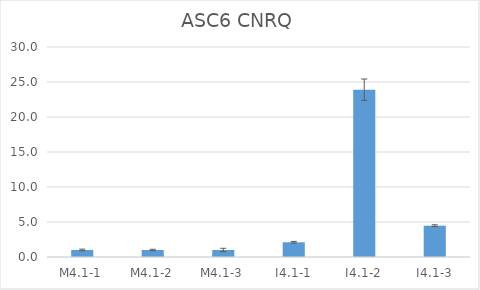
| Category | ASC6 CNRQ |
|---|---|
| M4.1-1 | 1 |
| M4.1-2 | 1 |
| M4.1-3 | 1 |
| I4.1-1 | 2.104 |
| I4.1-2 | 23.904 |
| I4.1-3 | 4.471 |